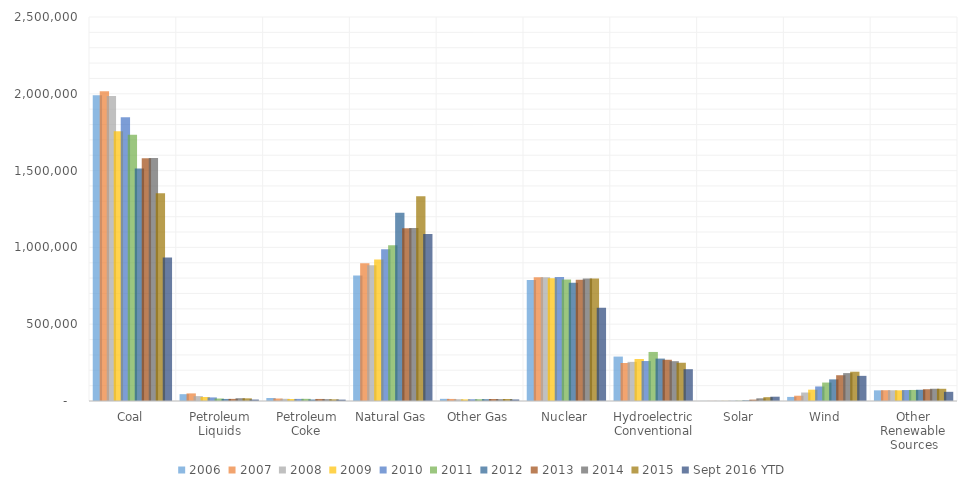
| Category | 2006 | 2007 | 2008 | 2009 | 2010 | 2011 | 2012 | 2013 | 2014 | 2015 | Sept 2016 YTD |
|---|---|---|---|---|---|---|---|---|---|---|---|
| Coal | 1990511 | 2016456 | 1985801 | 1755904 | 1847290 | 1733430 | 1514043 | 1581115 | 1581710 | 1352398 | 934772 |
| Petroleum Liquids | 44460 | 49505 | 31917 | 25972 | 23337 | 16086 | 13403 | 13820 | 18276 | 17372 | 9529 |
| Petroleum Coke | 19706 | 16234 | 14325 | 12964 | 13724 | 14096 | 9787 | 13344 | 11955 | 10877 | 8974 |
| Natural Gas | 816441 | 896590 | 882981 | 920979 | 987697 | 1013689 | 1225894 | 1124836 | 1126609 | 1333482 | 1087236 |
| Other Gas | 14177 | 13453 | 11707 | 10632 | 11313 | 11566 | 11898 | 12853 | 12022 | 13117 | 10095 |
| Nuclear | 787219 | 806425 | 806208 | 798855 | 806968 | 790204 | 769331 | 789016 | 797166 | 797178 | 607720 |
| Hydroelectric Conventional | 289246 | 247510 | 254831 | 273445 | 260203 | 319355 | 276240 | 268565 | 259367 | 249080 | 207157 |
| Solar | 508 | 612 | 864 | 891 | 1212 | 1818 | 4327 | 9036 | 17691 | 24893 | 28058 |
| Wind | 26589 | 34450 | 55363 | 73886 | 94652 | 120177 | 140822 | 167840 | 181655 | 190719 | 163743 |
| Other Renewable Sources | 69429 | 70176 | 69874 | 69502 | 71309 | 71986 | 73184 | 76632 | 79867 | 79549 | 59890 |